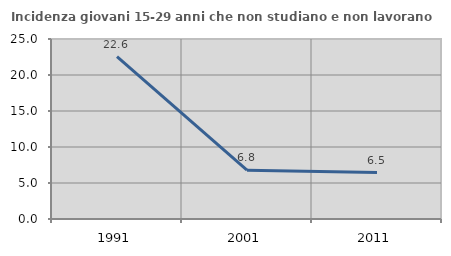
| Category | Incidenza giovani 15-29 anni che non studiano e non lavorano  |
|---|---|
| 1991.0 | 22.561 |
| 2001.0 | 6.787 |
| 2011.0 | 6.452 |